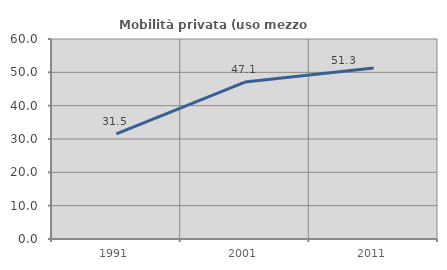
| Category | Mobilità privata (uso mezzo privato) |
|---|---|
| 1991.0 | 31.524 |
| 2001.0 | 47.085 |
| 2011.0 | 51.327 |